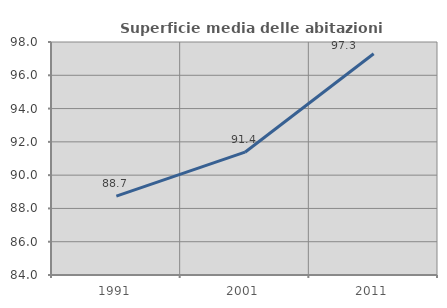
| Category | Superficie media delle abitazioni occupate |
|---|---|
| 1991.0 | 88.74 |
| 2001.0 | 91.379 |
| 2011.0 | 97.297 |